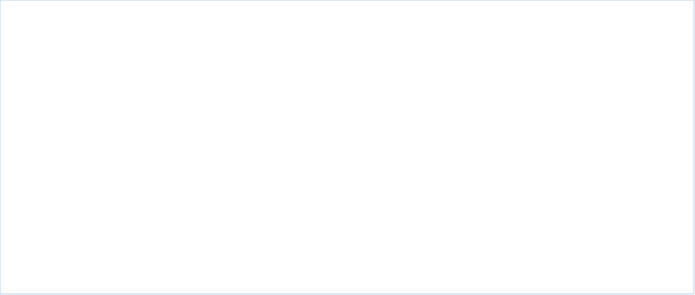
| Category | Fixed Cost | Freight & Forwarding | Other variable cost | Power & Fuel | Profit |
|---|---|---|---|---|---|
| ACC Ltd | 141 | 106 | 94 | 106 | 53 |
| Ambuja Cement | 134 | 122 | 56 | 114 | 74 |
| JK Lakshmi Cement | 95 | 104 | 133 | 116 | 52 |
| Ultratech Cement | 116 | 110 | 88 | 107 | 79 |